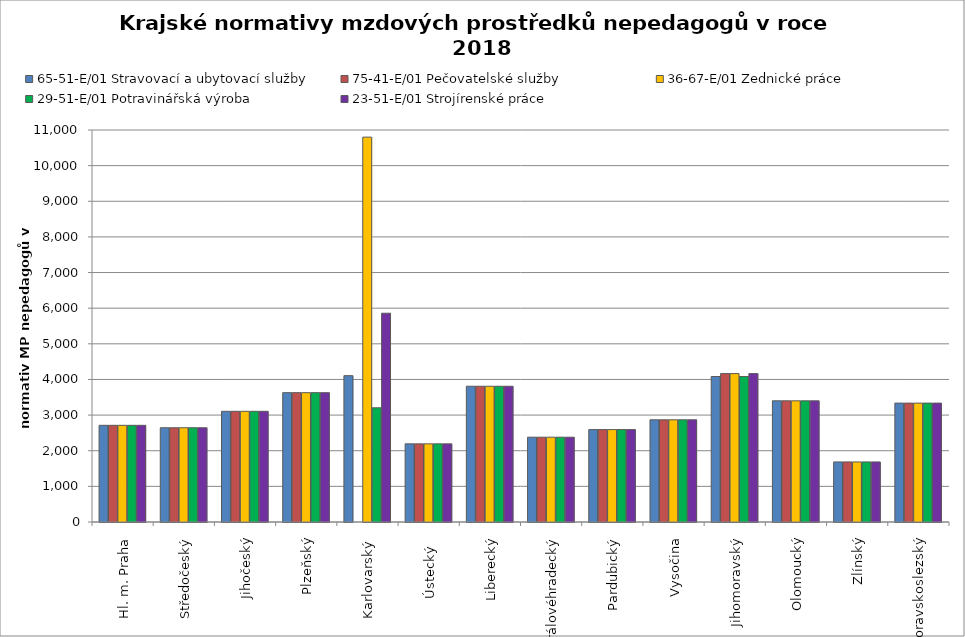
| Category | 65-51-E/01 Stravovací a ubytovací služby | 75-41-E/01 Pečovatelské služby | 36-67-E/01 Zednické práce | 29-51-E/01 Potravinářská výroba | 23-51-E/01 Strojírenské práce |
|---|---|---|---|---|---|
| Hl. m. Praha | 2712.883 | 2712.883 | 2712.883 | 2712.883 | 2712.883 |
| Středočeský | 2644.97 | 2644.97 | 2644.97 | 2644.97 | 2644.97 |
| Jihočeský | 3106.206 | 3106.206 | 3106.206 | 3106.206 | 3106.206 |
| Plzeňský | 3629.455 | 3629.455 | 3629.455 | 3629.455 | 3629.455 |
| Karlovarský  | 4106.464 | 0 | 10800 | 3204.748 | 5858.421 |
| Ústecký   | 2193.526 | 2193.526 | 2193.526 | 2193.526 | 2193.526 |
| Liberecký | 3809.239 | 3809.239 | 3809.239 | 3809.239 | 3809.239 |
| Královéhradecký | 2379.64 | 2379.64 | 2379.64 | 2379.64 | 2379.64 |
| Pardubický | 2593.113 | 2593.113 | 2593.113 | 2593.113 | 2593.113 |
| Vysočina | 2867.789 | 2867.789 | 2867.789 | 2867.789 | 2867.789 |
| Jihomoravský | 4083.182 | 4164.671 | 4164.671 | 4083.182 | 4164.671 |
| Olomoucký | 3400.44 | 3400.44 | 3400.44 | 3400.44 | 3400.44 |
| Zlínský | 1685.268 | 1685.268 | 1685.268 | 1685.268 | 1685.268 |
| Moravskoslezský | 3335.966 | 3335.966 | 3335.966 | 3335.966 | 3335.966 |